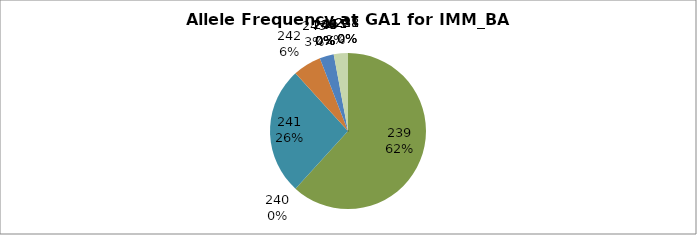
| Category | Series 0 |
|---|---|
| 221.0 | 0 |
| 238.0 | 0 |
| 239.0 | 0.618 |
| 240.0 | 0 |
| 241.0 | 0.265 |
| 242.0 | 0.059 |
| 243.0 | 0.029 |
| 244.0 | 0 |
| 245.0 | 0 |
| 246.0 | 0 |
| 247.0 | 0 |
| 248.0 | 0 |
| 249.0 | 0 |
| 250.0 | 0 |
| 251.0 | 0.029 |
| 253.0 | 0 |